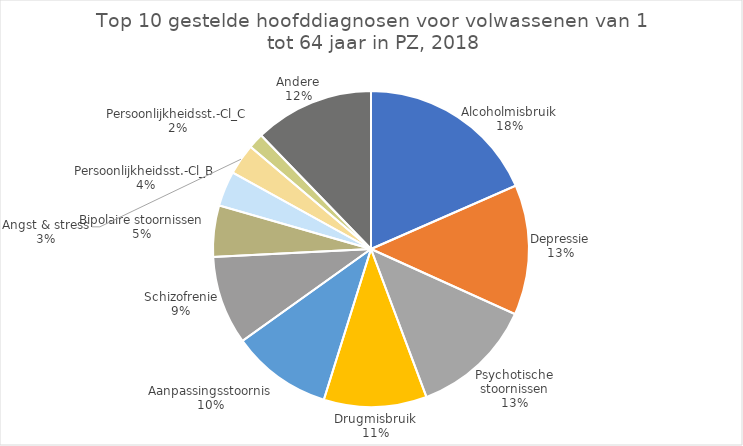
| Category | Aantal verblijven |
|---|---|
| Alcoholmisbruik | 8206 |
| Depressie | 5933 |
| Psychotische stoornissen | 5582 |
| Drugmisbruik | 4688 |
| Aanpassingsstoornis | 4582 |
| Schizofrenie | 4042 |
| Bipolaire stoornissen | 2337 |
| Persoonlijkheidsst.-Cl_B | 1602 |
| Angst & stress | 1403 |
| Persoonlijkheidsst.-Cl_C | 701 |
| Andere | 5445 |